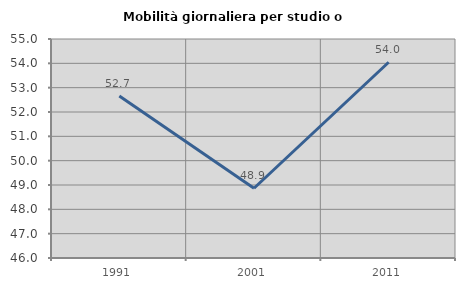
| Category | Mobilità giornaliera per studio o lavoro |
|---|---|
| 1991.0 | 52.655 |
| 2001.0 | 48.868 |
| 2011.0 | 54.044 |